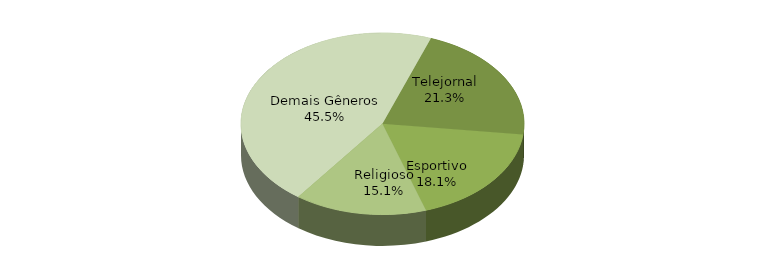
| Category | Series 0 |
|---|---|
| Telejornal | 112120 |
| Esportivo | 95384 |
| Religioso | 79204 |
| Demais Gêneros | 238892 |